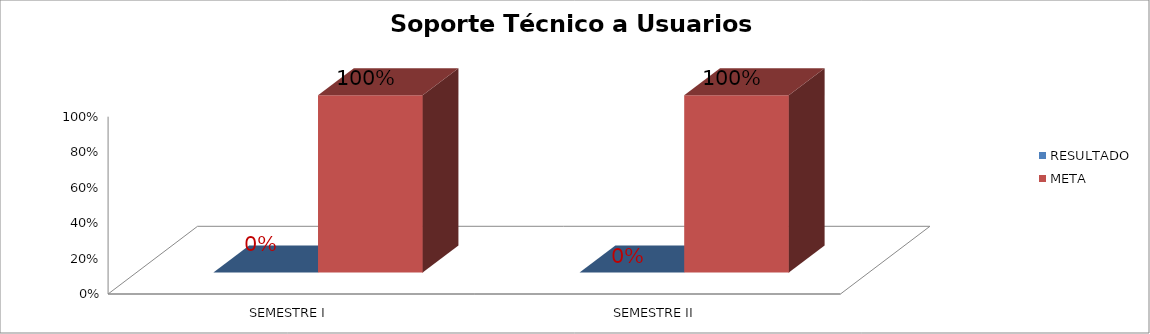
| Category | RESULTADO | META |
|---|---|---|
| SEMESTRE I | 0 | 1 |
| SEMESTRE II | 0 | 1 |